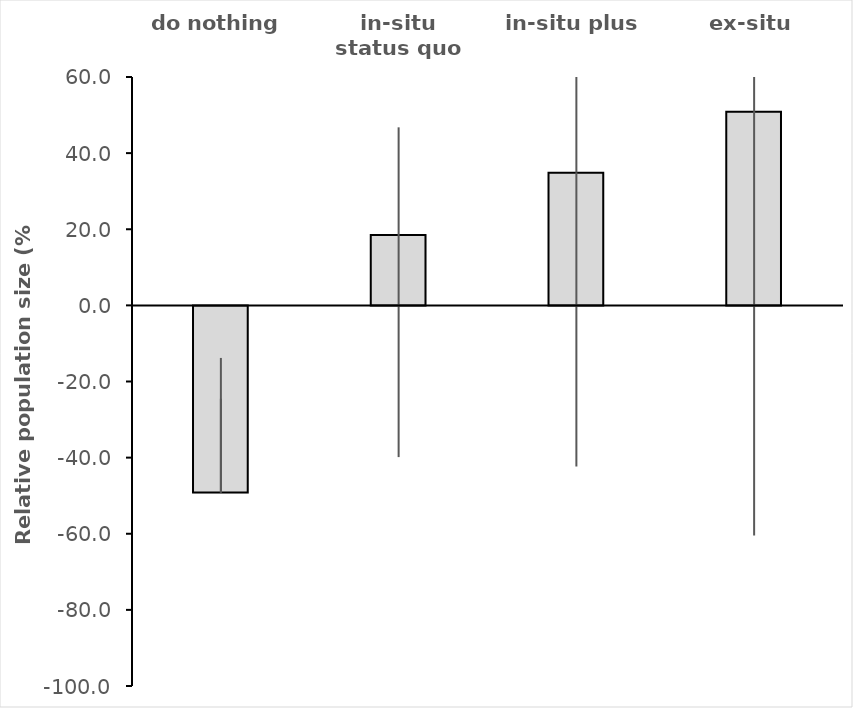
| Category | best estimate |
|---|---|
| do nothing | -49.167 |
| in-situ status quo | 18.458 |
| in-situ plus | 34.861 |
| ex-situ | 50.848 |